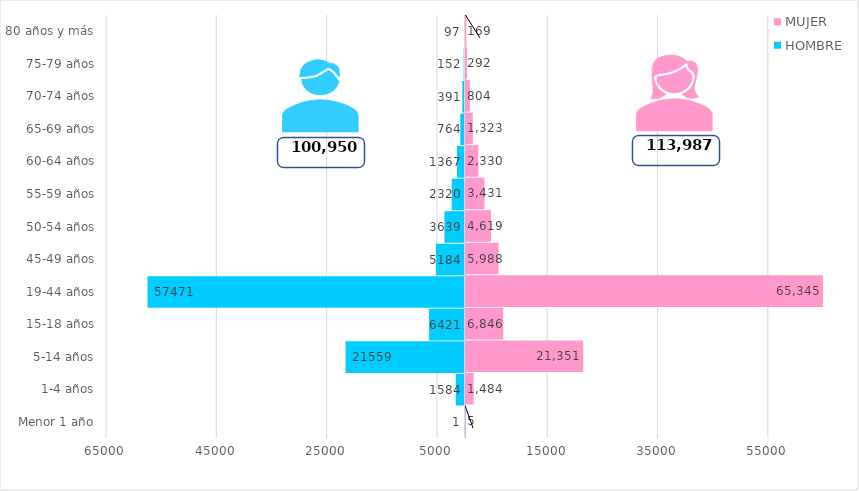
| Category | HOMBRE | MUJER |
|---|---|---|
| Menor 1 año | -1 | 5 |
| 1-4 años | -1584 | 1484 |
| 5-14 años | -21559 | 21351 |
| 15-18 años | -6421 | 6846 |
| 19-44 años | -57471 | 65345 |
| 45-49 años | -5184 | 5988 |
| 50-54 años | -3639 | 4619 |
| 55-59 años | -2320 | 3431 |
| 60-64 años | -1367 | 2330 |
| 65-69 años | -764 | 1323 |
| 70-74 años | -391 | 804 |
| 75-79 años | -152 | 292 |
| 80 años y más | -97 | 169 |